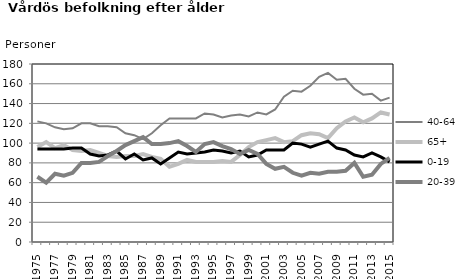
| Category | 40-64 | 65+ | 0-19 | 20-39 |
|---|---|---|---|---|
| 1975.0 | 122 | 96 | 94 | 66 |
| 1976.0 | 120 | 101 | 94 | 60 |
| 1977.0 | 116 | 95 | 94 | 69 |
| 1978.0 | 114 | 98 | 94 | 67 |
| 1979.0 | 115 | 93 | 95 | 70 |
| 1980.0 | 120 | 92 | 95 | 80 |
| 1981.0 | 120 | 93 | 89 | 80 |
| 1982.0 | 117 | 90 | 87 | 81 |
| 1983.0 | 117 | 87 | 88 | 87 |
| 1984.0 | 116 | 86 | 92 | 92 |
| 1985.0 | 110 | 87 | 84 | 98 |
| 1986.0 | 108 | 87 | 89 | 102 |
| 1987.0 | 104 | 89 | 83 | 106 |
| 1988.0 | 110 | 86 | 85 | 99 |
| 1989.0 | 118 | 84 | 79 | 99 |
| 1990.0 | 125 | 76 | 85 | 100 |
| 1991.0 | 125 | 79 | 91 | 102 |
| 1992.0 | 125 | 83 | 89 | 97 |
| 1993.0 | 125 | 81 | 90 | 91 |
| 1994.0 | 130 | 81 | 91 | 99 |
| 1995.0 | 129 | 81 | 93 | 101 |
| 1996.0 | 126 | 82 | 92 | 97 |
| 1997.0 | 128 | 81 | 90 | 94 |
| 1998.0 | 129 | 88 | 92 | 89 |
| 1999.0 | 127 | 96 | 86 | 93 |
| 2000.0 | 131 | 101 | 88 | 89 |
| 2001.0 | 129 | 103 | 93 | 79 |
| 2002.0 | 134 | 105 | 93 | 74 |
| 2003.0 | 147 | 101 | 93 | 76 |
| 2004.0 | 153 | 102 | 100 | 70 |
| 2005.0 | 152 | 108 | 99 | 67 |
| 2006.0 | 158 | 110 | 96 | 70 |
| 2007.0 | 167 | 109 | 99 | 69 |
| 2008.0 | 171 | 105 | 102 | 71 |
| 2009.0 | 164 | 115 | 95 | 71 |
| 2010.0 | 165 | 122 | 93 | 72 |
| 2011.0 | 155 | 126 | 88 | 80 |
| 2012.0 | 149 | 121 | 86 | 66 |
| 2013.0 | 150 | 125 | 90 | 68 |
| 2014.0 | 143 | 131 | 86 | 79 |
| 2015.0 | 146 | 129 | 81 | 85 |